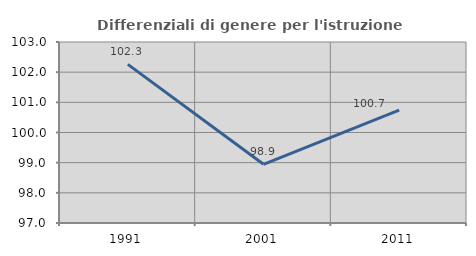
| Category | Differenziali di genere per l'istruzione superiore |
|---|---|
| 1991.0 | 102.258 |
| 2001.0 | 98.945 |
| 2011.0 | 100.743 |